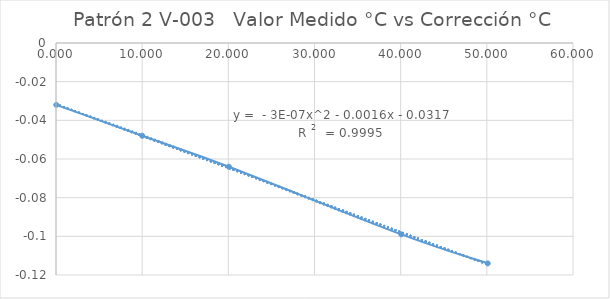
| Category | Patrón 2 V-003 |
|---|---|
| 0.032 | -0.032 |
| 10.012 | -0.048 |
| 20.064 | -0.064 |
| 40.075 | -0.099 |
| 50.103 | -0.114 |